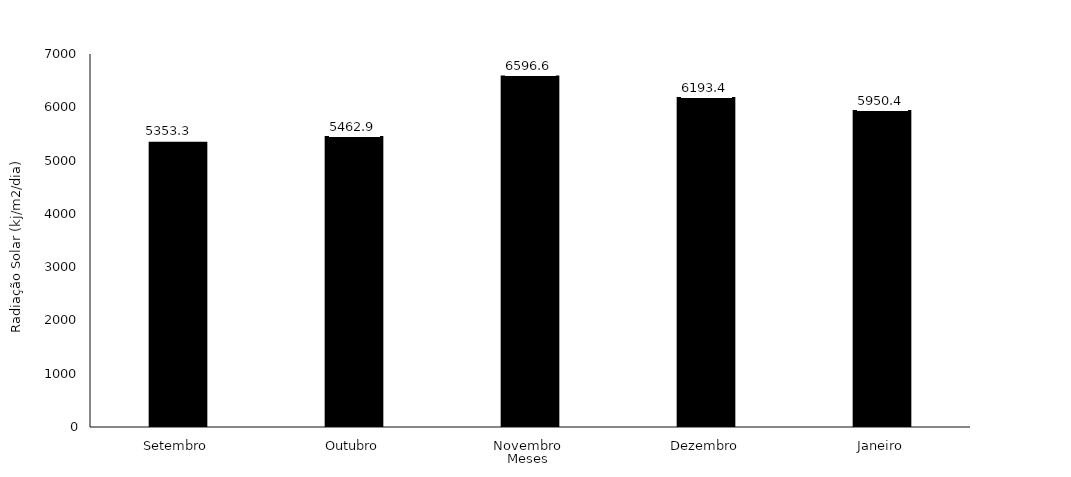
| Category | 2017 |
|---|---|
| Setembro | 5353.3 |
| Outubro | 5462.9 |
| Novembro | 6596.6 |
| Dezembro | 6193.4 |
| Janeiro | 5950.4 |